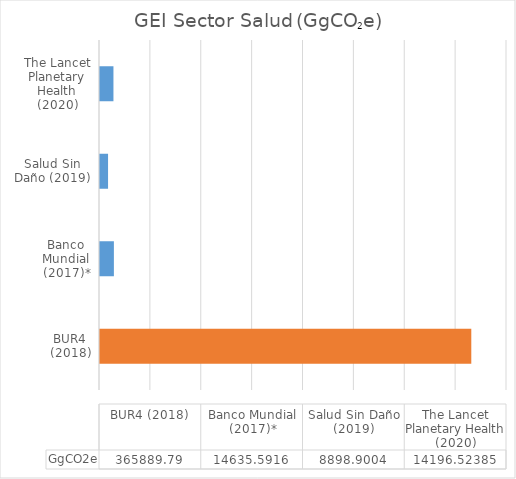
| Category | GgCO2e |
|---|---|
| BUR4 (2018) | 365889.79 |
| Banco Mundial (2017)* | 14635.592 |
| Salud Sin Daño (2019) | 8898.9 |
| The Lancet Planetary Health (2020) | 14196.524 |